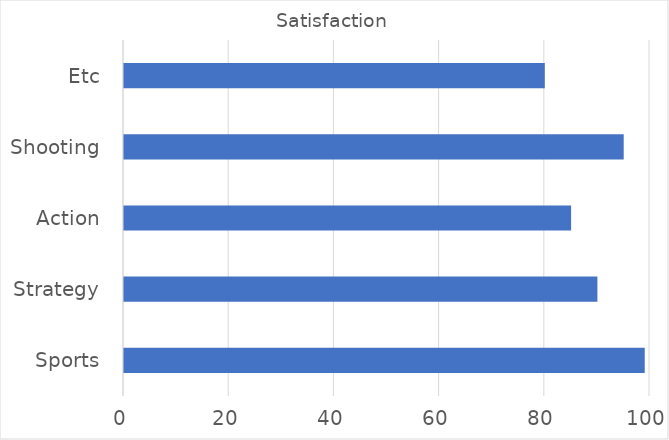
| Category | Satisfaction |
|---|---|
| Sports | 99 |
| Strategy | 90 |
| Action | 85 |
| Shooting | 95 |
| Etc | 80 |